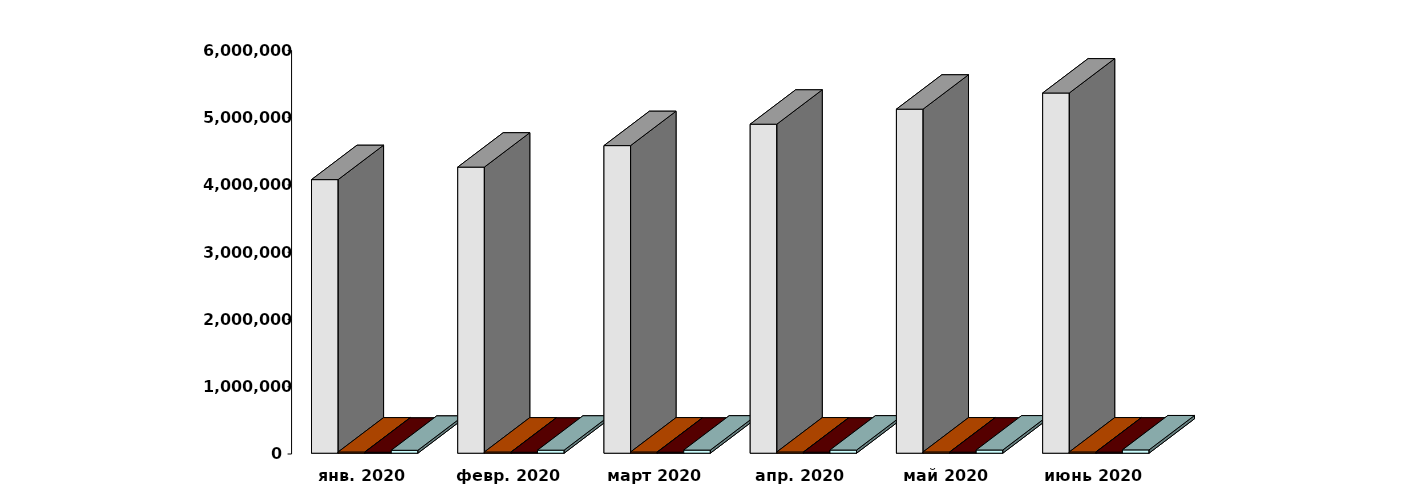
| Category | Физические лица | Юридические лица | Иностранные лица | Клиенты, передавшие свои средства в ДУ |
|---|---|---|---|---|
| 2020-01-29 | 4067317 | 17706 | 14182 | 43400 |
| 2020-02-29 | 4253153 | 17783 | 14404 | 45201 |
| 2020-03-30 | 4572906 | 17928 | 14988 | 46297 |
| 2020-04-30 | 4891213 | 18138 | 15242 | 46759 |
| 2020-05-30 | 5114736 | 18257 | 15483 | 47445 |
| 2020-06-30 | 5354906 | 18261 | 15817 | 49363 |